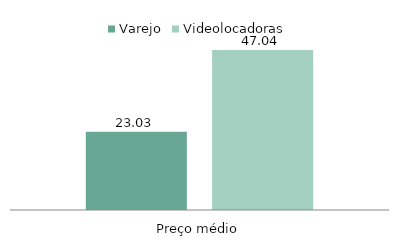
| Category | Varejo | Videolocadoras |
|---|---|---|
| Preço médio | 23.028 | 47.043 |